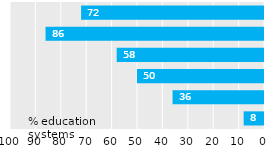
| Category | Teachers |
|---|---|
| ECEC | 72 |
| Primary-upper secondary | 86 |
| Post-secondary, non-tertiary | 58 |
| Tertiary | 50 |
| Adult education | 36 |
| Not known | 8 |